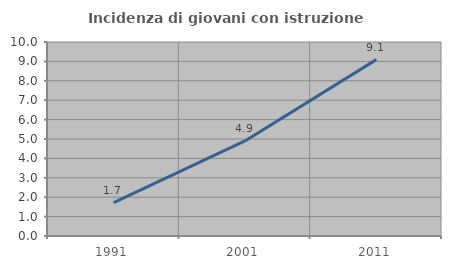
| Category | Incidenza di giovani con istruzione universitaria |
|---|---|
| 1991.0 | 1.724 |
| 2001.0 | 4.902 |
| 2011.0 | 9.091 |